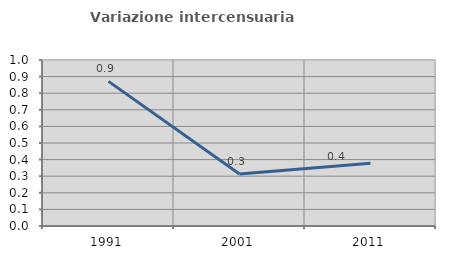
| Category | Variazione intercensuaria annua |
|---|---|
| 1991.0 | 0.871 |
| 2001.0 | 0.313 |
| 2011.0 | 0.379 |